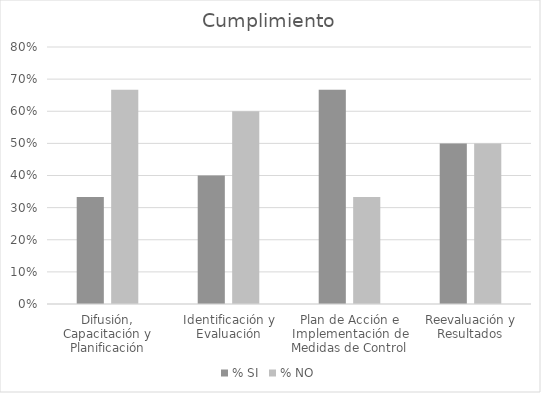
| Category | % SI | % NO |
|---|---|---|
| Difusión, Capacitación y Planificación | 0.333 | 0.667 |
| Identificación y Evaluación | 0.4 | 0.6 |
| Plan de Acción e Implementación de Medidas de Control | 0.667 | 0.333 |
| Reevaluación y Resultados | 0.5 | 0.5 |